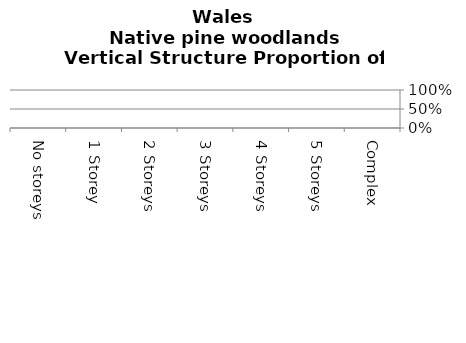
| Category | Native pine woodlands |
|---|---|
| No storeys | 0 |
| 1 Storey | 0 |
| 2 Storeys | 0 |
| 3 Storeys | 0 |
| 4 Storeys | 0 |
| 5 Storeys | 0 |
| Complex | 0 |